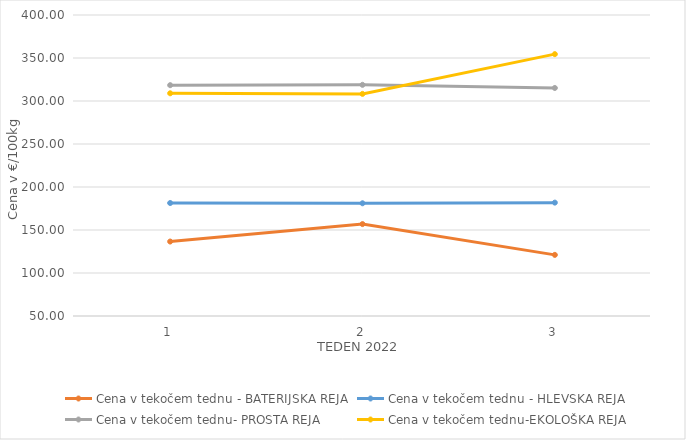
| Category | Cena v tekočem tednu - BATERIJSKA REJA | Cena v tekočem tednu - HLEVSKA REJA | Cena v tekočem tednu- PROSTA REJA | Cena v tekočem tednu-EKOLOŠKA REJA |
|---|---|---|---|---|
| 1.0 | 136.59 | 181.38 | 318.4 | 308.97 |
| 2.0 | 156.88 | 181.07 | 318.82 | 308.28 |
| 3.0 | 121.07 | 181.83 | 315.14 | 354.48 |